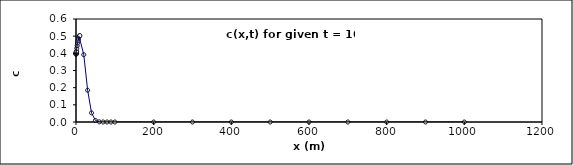
| Category | Series 0 |
|---|---|
| 0.1 | 0.394 |
| 0.2 | 0.396 |
| 0.3 | 0.398 |
| 0.4 | 0.4 |
| 0.5 | 0.402 |
| 0.6 | 0.404 |
| 0.7 | 0.405 |
| 0.8 | 0.407 |
| 0.9 | 0.409 |
| 1.0 | 0.411 |
| 2.0 | 0.429 |
| 3.0 | 0.445 |
| 4.0 | 0.46 |
| 5.0 | 0.473 |
| 6.0 | 0.484 |
| 7.0 | 0.492 |
| 8.0 | 0.498 |
| 9.0 | 0.502 |
| 10.0 | 0.503 |
| 20.0 | 0.392 |
| 30.0 | 0.185 |
| 40.0 | 0.053 |
| 50.0 | 0.009 |
| 60.0 | 0.001 |
| 70.0 | 0 |
| 80.0 | 0 |
| 90.0 | 0 |
| 100.0 | 0 |
| 200.0 | 0 |
| 300.0 | 0 |
| 400.0 | 0 |
| 500.0 | 0 |
| 600.0 | 0 |
| 700.0 | 0 |
| 800.0 | 0 |
| 900.0 | 0 |
| 1000.0 | 0 |